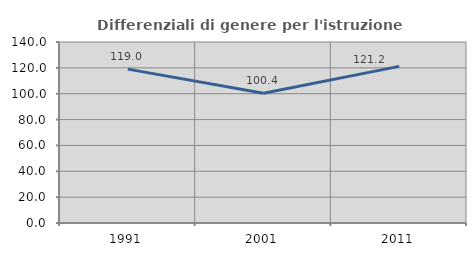
| Category | Differenziali di genere per l'istruzione superiore |
|---|---|
| 1991.0 | 119.027 |
| 2001.0 | 100.36 |
| 2011.0 | 121.162 |